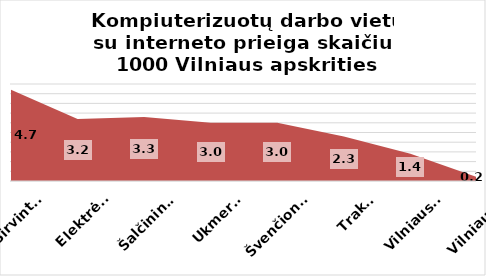
| Category | Series 0 |
|---|---|
| Širvintos | 4.7 |
| Elektrėnai | 3.2 |
| Šalčininkai | 3.3 |
| Ukmergė | 3 |
| Švenčionys | 3 |
| Trakai | 2.3 |
| Vilniaus r. | 1.4 |
| Vilniaus m. | 0.2 |